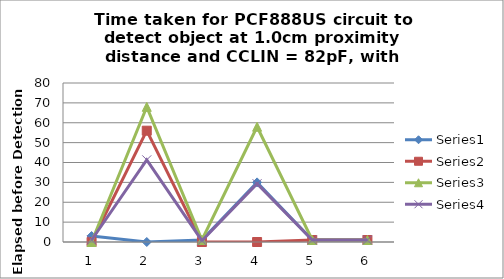
| Category | Series 0 | Series 1 | Series 2 | Series 3 |
|---|---|---|---|---|
| 0 | 3 | 0 | 0 | 1 |
| 1 | 0 | 56 | 68 | 41.333 |
| 2 | 1 | 0 | 1 | 0.667 |
| 3 | 30 | 0 | 58 | 29.333 |
| 4 | 1 | 1 | 1 | 1 |
| 5 | 1 | 1 | 1 | 1 |